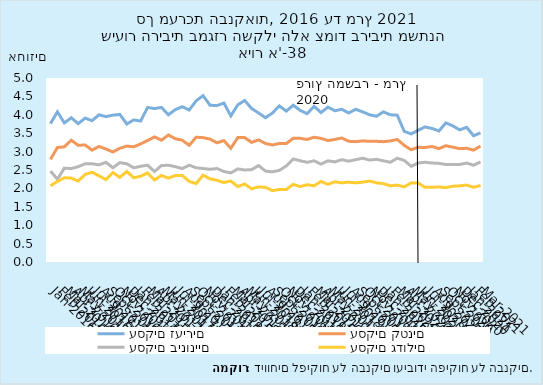
| Category | 12194 | עסקים זעירים | עסקים קטנים | עסקים בינוניים | עסקים גדולים |
|---|---|---|---|---|---|
| 2016-01-31 |  | 3.76 | 2.79 | 2.47 | 2.07 |
| 2016-02-29 |  | 4.08 | 3.11 | 2.25 | 2.19 |
| 2016-03-31 |  | 3.78 | 3.13 | 2.55 | 2.29 |
| 2016-04-30 |  | 3.92 | 3.31 | 2.54 | 2.28 |
| 2016-05-31 |  | 3.76 | 3.17 | 2.59 | 2.2 |
| 2016-06-30 |  | 3.91 | 3.18 | 2.67 | 2.38 |
| 2016-07-31 |  | 3.84 | 3.04 | 2.67 | 2.44 |
| 2016-08-31 |  | 4 | 3.14 | 2.64 | 2.34 |
| 2016-09-30 |  | 3.95 | 3.07 | 2.71 | 2.24 |
| 2016-10-31 |  | 3.99 | 2.99 | 2.56 | 2.43 |
| 2016-11-30 |  | 4.01 | 3.09 | 2.7 | 2.3 |
| 2016-12-31 |  | 3.75 | 3.15 | 2.67 | 2.46 |
| 2017-01-31 |  | 3.86 | 3.13 | 2.56 | 2.29 |
| 2017-02-28 |  | 3.83 | 3.21 | 2.6 | 2.33 |
| 2017-03-31 |  | 4.2 | 3.3 | 2.63 | 2.42 |
| 2017-04-30 |  | 4.17 | 3.4 | 2.46 | 2.23 |
| 2017-05-31 |  | 4.2 | 3.31 | 2.62 | 2.35 |
| 2017-06-30 |  | 4 | 3.45 | 2.63 | 2.28 |
| 2017-07-31 |  | 4.14 | 3.35 | 2.59 | 2.35 |
| 2017-08-31 |  | 4.22 | 3.31 | 2.54 | 2.35 |
| 2017-09-30 |  | 4.13 | 3.17 | 2.63 | 2.19 |
| 2017-10-31 |  | 4.38 | 3.39 | 2.56 | 2.13 |
| 2017-11-30 |  | 4.52 | 3.38 | 2.54 | 2.36 |
| 2017-12-31 |  | 4.26 | 3.34 | 2.52 | 2.26 |
| 2018-01-31 |  | 4.25 | 3.24 | 2.54 | 2.22 |
| 2018-02-28 |  | 4.32 | 3.3 | 2.46 | 2.16 |
| 2018-03-31 |  | 3.97 | 3.09 | 2.42 | 2.2 |
| 2018-04-30 |  | 4.27 | 3.38 | 2.53 | 2.05 |
| 2018-05-31 |  | 4.39 | 3.38 | 2.5 | 2.12 |
| 2018-06-30 |  | 4.17 | 3.25 | 2.51 | 1.99 |
| 2018-07-31 |  | 4.05 | 3.32 | 2.62 | 2.04 |
| 2018-08-31 |  | 3.92 | 3.22 | 2.47 | 2.03 |
| 2018-09-30 |  | 4.05 | 3.18 | 2.45 | 1.94 |
| 2018-10-31 |  | 4.24 | 3.22 | 2.49 | 1.97 |
| 2018-11-30 |  | 4.1 | 3.22 | 2.61 | 1.97 |
| 2018-12-31 |  | 4.26 | 3.36 | 2.8 | 2.11 |
| 2019-01-31 |  | 4.12 | 3.36 | 2.75 | 2.05 |
| 2019-02-28 |  | 4.03 | 3.33 | 2.71 | 2.1 |
| 2019-03-31 |  | 4.23 | 3.39 | 2.75 | 2.07 |
| 2019-04-30 |  | 4.06 | 3.36 | 2.66 | 2.19 |
| 2019-05-31 |  | 4.21 | 3.3 | 2.75 | 2.11 |
| 2019-06-30 |  | 4.11 | 3.33 | 2.72 | 2.18 |
| 2019-07-31 |  | 4.15 | 3.37 | 2.78 | 2.15 |
| 2019-08-31 |  | 4.05 | 3.28 | 2.74 | 2.17 |
| 2019-09-30 |  | 4.15 | 3.27 | 2.78 | 2.15 |
| 2019-10-31 |  | 4.08 | 3.29 | 2.82 | 2.17 |
| 2019-11-30 |  | 4 | 3.28 | 2.77 | 2.2 |
| 2019-12-31 |  | 3.96 | 3.28 | 2.79 | 2.15 |
| 2020-01-31 |  | 4.08 | 3.27 | 2.75 | 2.13 |
| 2020-02-29 |  | 4 | 3.29 | 2.71 | 2.07 |
| 2020-03-31 |  | 3.99 | 3.33 | 2.82 | 2.09 |
| 2020-04-30 |  | 3.55 | 3.17 | 2.76 | 2.04 |
| 2020-05-31 |  | 3.48 | 3.05 | 2.6 | 2.15 |
| 2020-06-30 |  | 3.58 | 3.12 | 2.69 | 2.15 |
| 2020-07-31 |  | 3.67 | 3.11 | 2.71 | 2.03 |
| 2020-08-31 |  | 3.63 | 3.14 | 2.69 | 2.03 |
| 2020-09-30 |  | 3.56 | 3.08 | 2.68 | 2.04 |
| 2020-10-31 |  | 3.78 | 3.16 | 2.65 | 2.02 |
| 2020-11-30 |  | 3.7 | 3.12 | 2.65 | 2.06 |
| 2020-12-31 |  | 3.59 | 3.08 | 2.65 | 2.07 |
| 2021-01-31 |  | 3.66 | 3.09 | 2.69 | 2.09 |
| 2021-02-28 |  | 3.43 | 3.04 | 2.63 | 2.03 |
| 2021-03-31 |  | 3.51 | 3.15 | 2.72 | 2.08 |